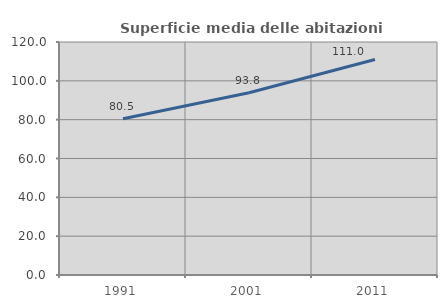
| Category | Superficie media delle abitazioni occupate |
|---|---|
| 1991.0 | 80.516 |
| 2001.0 | 93.842 |
| 2011.0 | 110.981 |